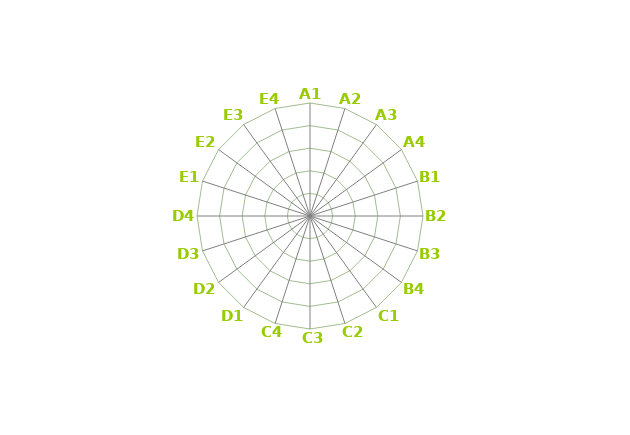
| Category | Series 0 |
|---|---|
| A1 | 0 |
| A2 | 0 |
| A3 | 0 |
| A4 | 0 |
| B1 | 0 |
| B2 | 0 |
| B3 | 0 |
| B4 | 0 |
| C1 | 0 |
| C2 | 0 |
| C3 | 0 |
| C4 | 0 |
| D1 | 0 |
| D2 | 0 |
| D3 | 0 |
| D4 | 0 |
| E1 | 0 |
| E2 | 0 |
| E3 | 0 |
| E4 | 0 |